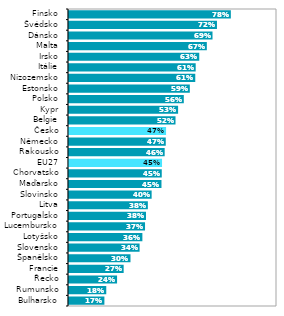
| Category | Series 0 |
|---|---|
| Bulharsko | 0.175 |
| Rumunsko | 0.184 |
| Řecko | 0.236 |
| Francie | 0.268 |
| Španělsko | 0.3 |
| Slovensko | 0.344 |
| Lotyšsko | 0.358 |
| Lucembursko | 0.37 |
| Portugalsko | 0.375 |
| Litva | 0.384 |
| Slovinsko | 0.402 |
| Maďarsko | 0.449 |
| Chorvatsko | 0.451 |
| EU27 | 0.452 |
| Rakousko | 0.465 |
| Německo | 0.47 |
| Česko | 0.472 |
| Belgie | 0.517 |
| Kypr | 0.529 |
| Polsko | 0.557 |
| Estonsko | 0.586 |
| Nizozemsko | 0.612 |
| Itálie | 0.614 |
| Irsko | 0.631 |
| Malta | 0.667 |
| Dánsko | 0.695 |
| Švédsko | 0.716 |
| Finsko | 0.783 |